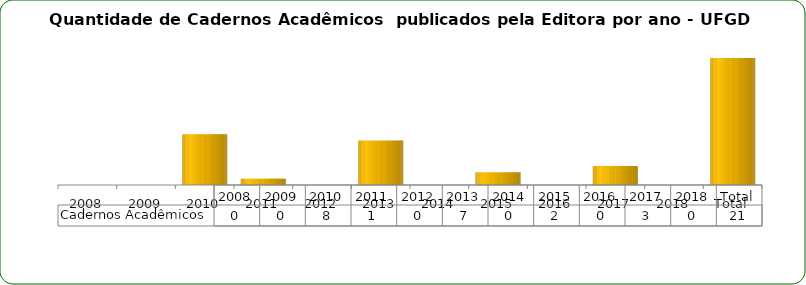
| Category | Cadernos Acadêmicos  |
|---|---|
| 2008 | 0 |
| 2009 | 0 |
| 2010 | 8 |
| 2011 | 1 |
| 2012 | 0 |
| 2013 | 7 |
| 2014 | 0 |
| 2015 | 2 |
| 2016 | 0 |
| 2017 | 3 |
| 2018 | 0 |
| Total | 21 |